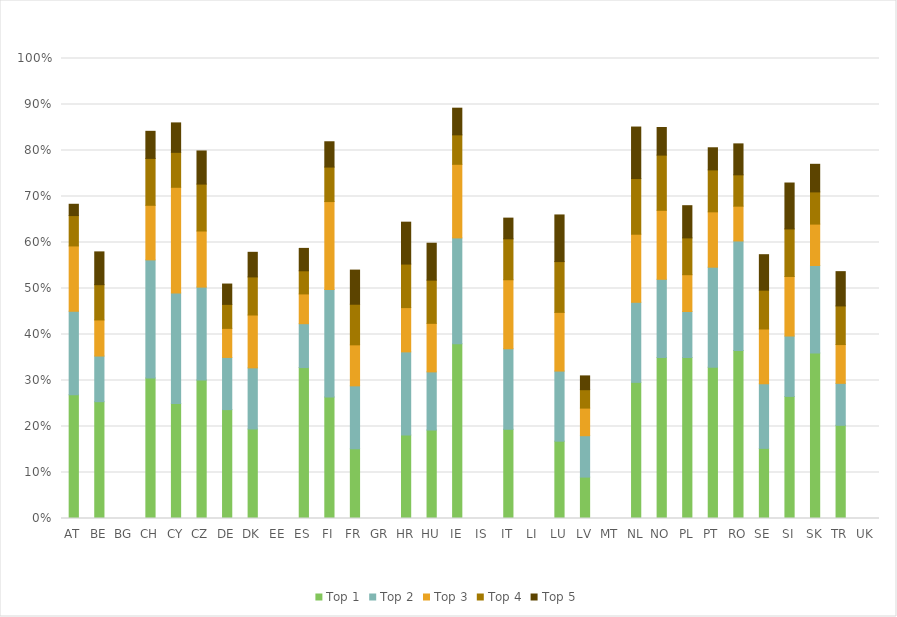
| Category | Top 1 | Top 2 | Top 3 | Top 4 | Top 5 |
|---|---|---|---|---|---|
| AT | 0.269 | 0.181 | 0.142 | 0.066 | 0.025 |
| BE | 0.254 | 0.099 | 0.078 | 0.077 | 0.071 |
| BG | 0 | 0 | 0 | 0 | 0 |
| CH | 0.306 | 0.257 | 0.119 | 0.102 | 0.059 |
| CY | 0.25 | 0.24 | 0.23 | 0.076 | 0.064 |
| CZ | 0.301 | 0.202 | 0.122 | 0.102 | 0.072 |
| DE | 0.237 | 0.113 | 0.063 | 0.052 | 0.044 |
| DK | 0.195 | 0.133 | 0.115 | 0.083 | 0.053 |
| EE | 0 | 0 | 0 | 0 | 0 |
| ES | 0.328 | 0.095 | 0.065 | 0.05 | 0.049 |
| FI | 0.264 | 0.234 | 0.191 | 0.075 | 0.055 |
| FR | 0.152 | 0.137 | 0.089 | 0.088 | 0.074 |
| GR | 0 | 0 | 0 | 0 | 0 |
| HR | 0.182 | 0.181 | 0.096 | 0.095 | 0.091 |
| HU | 0.192 | 0.126 | 0.106 | 0.094 | 0.08 |
| IE | 0.38 | 0.23 | 0.16 | 0.064 | 0.058 |
| IS | 0 | 0 | 0 | 0 | 0 |
| IT | 0.194 | 0.175 | 0.15 | 0.089 | 0.045 |
| LI | 0 | 0 | 0 | 0 | 0 |
| LU | 0.168 | 0.152 | 0.128 | 0.11 | 0.101 |
| LV | 0.09 | 0.09 | 0.06 | 0.04 | 0.03 |
| MT | 0 | 0 | 0 | 0 | 0 |
| NL | 0.296 | 0.174 | 0.148 | 0.121 | 0.112 |
| NO | 0.35 | 0.17 | 0.15 | 0.12 | 0.06 |
| PL | 0.35 | 0.1 | 0.08 | 0.08 | 0.07 |
| PT | 0.329 | 0.217 | 0.12 | 0.091 | 0.048 |
| RO | 0.365 | 0.238 | 0.076 | 0.068 | 0.067 |
| SE | 0.152 | 0.14 | 0.119 | 0.084 | 0.077 |
| SI | 0.265 | 0.131 | 0.129 | 0.103 | 0.1 |
| SK | 0.36 | 0.19 | 0.09 | 0.07 | 0.06 |
| TR | 0.203 | 0.091 | 0.084 | 0.084 | 0.075 |
| UK | 0 | 0 | 0 | 0 | 0 |